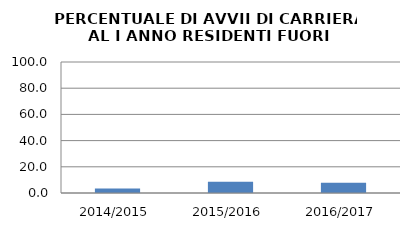
| Category | 2014/2015 2015/2016 2016/2017 |
|---|---|
| 2014/2015 | 3.488 |
| 2015/2016 | 8.571 |
| 2016/2017 | 7.767 |